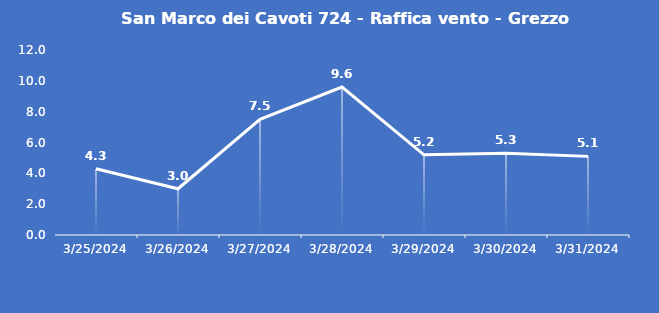
| Category | San Marco dei Cavoti 724 - Raffica vento - Grezzo (m/s) |
|---|---|
| 3/25/24 | 4.3 |
| 3/26/24 | 3 |
| 3/27/24 | 7.5 |
| 3/28/24 | 9.6 |
| 3/29/24 | 5.2 |
| 3/30/24 | 5.3 |
| 3/31/24 | 5.1 |